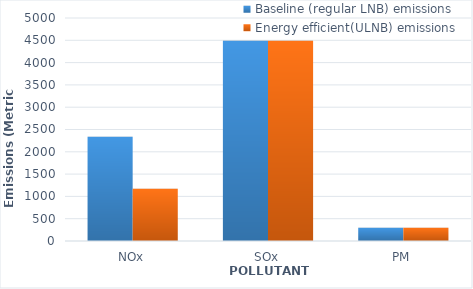
| Category | Baseline (regular LNB) emissions  | Energy efficient(ULNB) emissions  |
|---|---|---|
| NOx | 2339.742 | 1169.871 |
| SOx | 4491.189 | 4491.189 |
| PM | 298.755 | 298.755 |